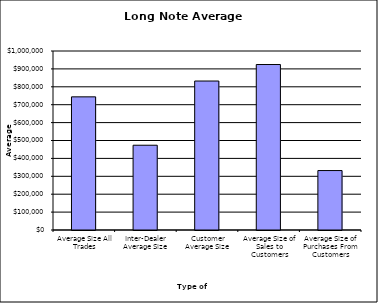
| Category | Security Type |
|---|---|
| Average Size All Trades | 743826.297 |
| Inter-Dealer Average Size | 473562.202 |
| Customer Average Size | 832288.758 |
| Average Size of Sales to Customers | 924466.846 |
| Average Size of Purchases From Customers | 332090.459 |